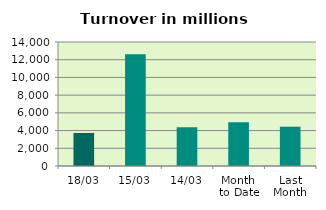
| Category | Series 0 |
|---|---|
| 18/03 | 3729.969 |
| 15/03 | 12623.63 |
| 14/03 | 4373.636 |
| Month 
to Date | 4944.431 |
| Last
Month | 4438.793 |